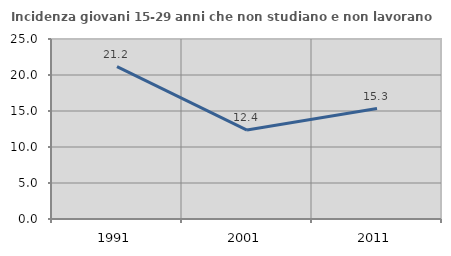
| Category | Incidenza giovani 15-29 anni che non studiano e non lavorano  |
|---|---|
| 1991.0 | 21.166 |
| 2001.0 | 12.355 |
| 2011.0 | 15.339 |